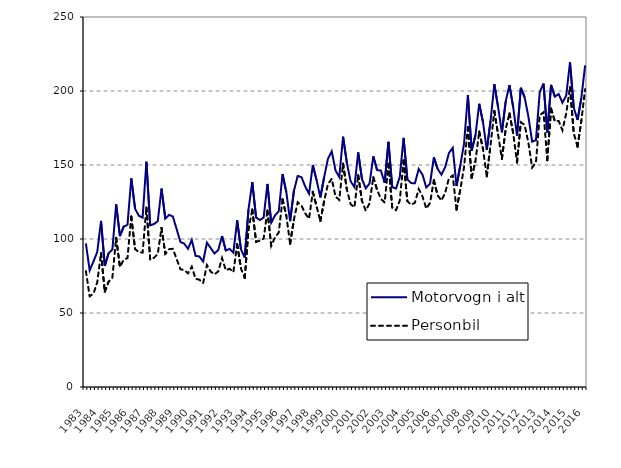
| Category | Motorvogn i alt | Personbil |
|---|---|---|
| 1983.0 | 97 | 78.3 |
| nan | 78.8 | 61.3 |
| nan | 84.8 | 63 |
| nan | 91.2 | 70.8 |
| 1984.0 | 112.2 | 90.4 |
| nan | 81.8 | 64.4 |
| nan | 90.4 | 71.1 |
| nan | 92.9 | 73.9 |
| 1985.0 | 123.4 | 100.8 |
| nan | 102 | 81.1 |
| nan | 108.4 | 86 |
| nan | 109.6 | 87.1 |
| 1986.0 | 141 | 115.2 |
| nan | 120.5 | 93.2 |
| nan | 115.7 | 91.1 |
| nan | 114.4 | 90.8 |
| 1987.0 | 152.2 | 121.3 |
| nan | 109.2 | 86.1 |
| nan | 110.1 | 87.3 |
| nan | 112 | 89.8 |
| 1988.0 | 134.1 | 107.5 |
| nan | 113.7 | 90 |
| nan | 116.3 | 93.1 |
| nan | 115.2 | 93.4 |
| 1989.0 | 106.6 | 86.4 |
| nan | 98 | 79.6 |
| nan | 96.9 | 79 |
| nan | 93.4 | 76.8 |
| 1990.0 | 99.4 | 81.3 |
| nan | 88.6 | 73.1 |
| nan | 88.2 | 72.5 |
| nan | 84.8 | 70.2 |
| 1991.0 | 97.5 | 82.4 |
| nan | 93.9 | 78 |
| nan | 90.2 | 76.1 |
| nan | 92.6 | 78.1 |
| 1992.0 | 102 | 87.1 |
| nan | 92.2 | 78.9 |
| nan | 93.3 | 79.9 |
| nan | 90.8 | 77.6 |
| 1993.0 | 112.6 | 96.5 |
| nan | 93 | 80.1 |
| nan | 87.5 | 73.6 |
| nan | 120.1 | 106.6 |
| 1994.0 | 138.4 | 120 |
| nan | 114.5 | 98.1 |
| nan | 112.8 | 98.8 |
| nan | 114.5 | 100.2 |
| 1995.0 | 137.2 | 119.3 |
| nan | 111 | 95.4 |
| nan | 115.9 | 101 |
| nan | 118.8 | 104.4 |
| 1996.0 | 143.9 | 126.9 |
| nan | 131.6 | 115.7 |
| nan | 112 | 96.7 |
| nan | 132.5 | 113.1 |
| 1997.0 | 142.6 | 124.8 |
| nan | 141.8 | 122.5 |
| nan | 135.4 | 117.3 |
| nan | 130.6 | 113.7 |
| 1998.0 | 150 | 131.9 |
| nan | 139.8 | 122 |
| nan | 128.1 | 112.1 |
| nan | 141.8 | 125.6 |
| 1999.0 | 154.2 | 137.1 |
| nan | 159.3 | 140.7 |
| nan | 146.3 | 128.7 |
| nan | 141.9 | 126.4 |
| 2000.0 | 169.1 | 150.9 |
| nan | 151.5 | 133.4 |
| nan | 139 | 123.5 |
| nan | 135.1 | 121.4 |
| 2001.0 | 158.5 | 143.1 |
| nan | 140.46 | 125.7 |
| nan | 134.24 | 119.2 |
| nan | 137.495 | 124.072 |
| 2002.0 | 155.814 | 141.724 |
| nan | 146.543 | 133.19 |
| nan | 146.231 | 127.141 |
| nan | 137.967 | 124.641 |
| 2003.0 | 165.679 | 150.811 |
| nan | 135.021 | 121.101 |
| nan | 134.111 | 119.491 |
| nan | 142.013 | 125.959 |
| 2004.0 | 168.309 | 153.043 |
| nan | 140.267 | 125.568 |
| nan | 137.77 | 123.121 |
| nan | 137.685 | 124.506 |
| 2005.0 | 147.311 | 133.756 |
| nan | 143.517 | 128.79 |
| nan | 134.783 | 120.571 |
| nan | 137.37 | 124.382 |
| 2006.0 | 155.213 | 139.728 |
| nan | 147.444 | 129.572 |
| nan | 143.451 | 126.006 |
| nan | 148.561 | 131.195 |
| 2007.0 | 158.1 | 141.084 |
| nan | 161.613 | 142.897 |
| nan | 135.821 | 119.753 |
| nan | 149.791 | 133.498 |
| 2008.0 | 164.642 | 148.614 |
| nan | 197.287 | 175.714 |
| nan | 159.718 | 141.407 |
| nan | 170.057 | 152.54 |
| 2009.0 | 191.38 | 172.559 |
| nan | 178.906 | 160.765 |
| nan | 160.234 | 142.312 |
| nan | 179.857 | 163.532 |
| 2010.0 | 204.636 | 186.507 |
| nan | 188.957 | 170.463 |
| nan | 172.077 | 154.156 |
| nan | 192.961 | 174.399 |
| 2011.0 | 204.005 | 184.86 |
| nan | 188.741 | 171.333 |
| nan | 169.934 | 151.694 |
| nan | 202.176 | 178.919 |
| 2012.0 | 195.829 | 177.072 |
| nan | 182.751 | 165.128 |
| nan | 165.73 | 148.242 |
| nan | 166.805 | 151.728 |
| 2013.0 | 199.181 | 183.653 |
| nan | 205.015 | 185.634 |
| nan | 172.044 | 153.21 |
| nan | 204.1 | 188.079 |
| 2014.0 | 196.177 | 179.552 |
| nan | 197.965 | 179.767 |
| nan | 192.105 | 173.474 |
| nan | 196.809 | 184.739 |
| 2015.0 | 219.419 | 202.592 |
| nan | 188.696 | 171.451 |
| nan | 180.388 | 162.297 |
| nan | 195.23 | 179.891 |
| 2016.0 | 217.298 | 201.197 |